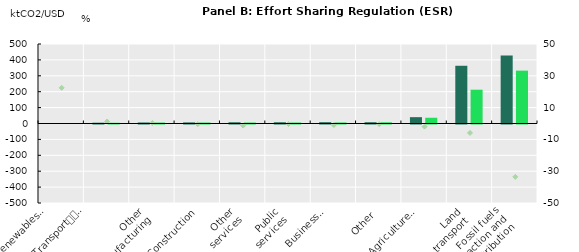
| Category | CO2 intensity in the baseline | CO2 intensity in the Fit for 55 |
|---|---|---|
| Renewables
and nuclear
electricity | 0 | 0 |
| Transport
and 
electric
 equipement | 5.025 | 4.662 |
| Other
manufacturing | 6.44 | 6.048 |
| Construction | 6.883 | 6.336 |
| Other
services | 7.787 | 6.231 |
| Public
services | 7.831 | 6.298 |
| Business
services | 8.328 | 6.663 |
| Other | 8.057 | 7.754 |
| Agriculture
 and food | 39.845 | 36.165 |
| Land
transport | 363.096 | 212.525 |
| Fossil fuels
extraction and
distribution | 427.573 | 332.522 |